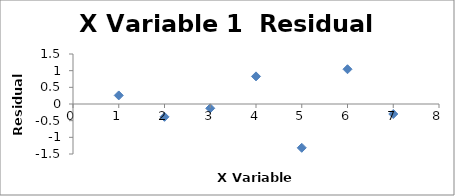
| Category | Series 0 |
|---|---|
| 1.0 | 0.257 |
| 2.0 | -0.386 |
| 3.0 | -0.129 |
| 4.0 | 0.829 |
| 5.0 | -1.314 |
| 6.0 | 1.043 |
| 7.0 | -0.3 |